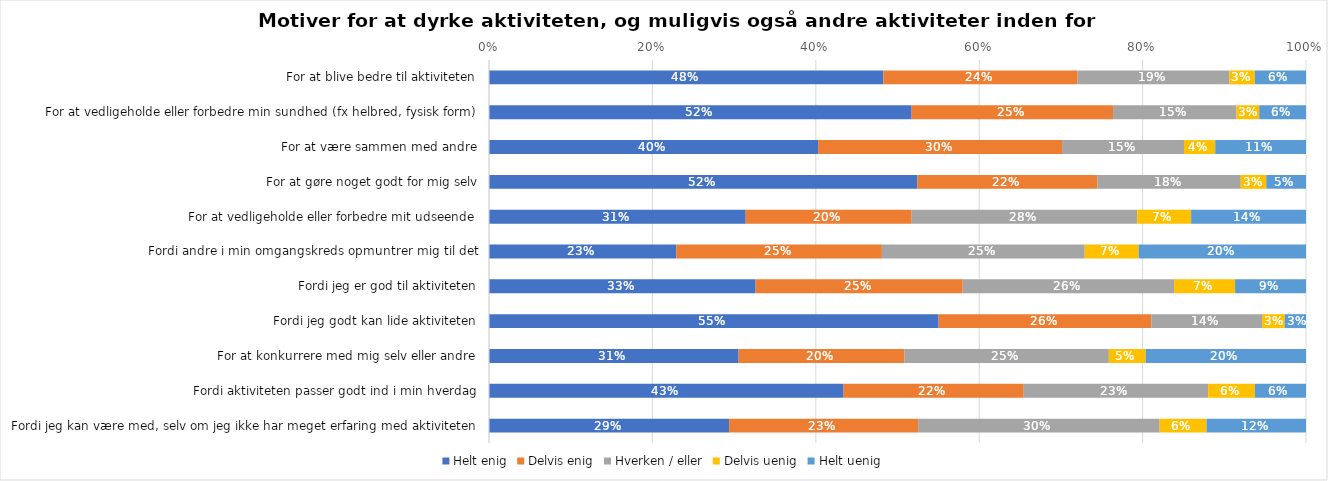
| Category | Helt enig | Delvis enig | Hverken / eller | Delvis uenig | Helt uenig |
|---|---|---|---|---|---|
| For at blive bedre til aktiviteten | 0.483 | 0.238 | 0.186 | 0.031 | 0.062 |
| For at vedligeholde eller forbedre min sundhed (fx helbred, fysisk form) | 0.517 | 0.247 | 0.151 | 0.028 | 0.057 |
| For at være sammen med andre | 0.403 | 0.299 | 0.149 | 0.038 | 0.111 |
| For at gøre noget godt for mig selv | 0.524 | 0.22 | 0.175 | 0.031 | 0.049 |
| For at vedligeholde eller forbedre mit udseende | 0.314 | 0.203 | 0.276 | 0.066 | 0.141 |
| Fordi andre i min omgangskreds opmuntrer mig til det | 0.229 | 0.252 | 0.248 | 0.066 | 0.205 |
| Fordi jeg er god til aktiviteten | 0.326 | 0.253 | 0.259 | 0.075 | 0.087 |
| Fordi jeg godt kan lide aktiviteten | 0.55 | 0.26 | 0.135 | 0.028 | 0.026 |
| For at konkurrere med mig selv eller andre | 0.306 | 0.203 | 0.25 | 0.045 | 0.196 |
| Fordi aktiviteten passer godt ind i min hverdag | 0.434 | 0.22 | 0.226 | 0.057 | 0.062 |
| Fordi jeg kan være med, selv om jeg ikke har meget erfaring med aktiviteten | 0.294 | 0.231 | 0.296 | 0.057 | 0.122 |